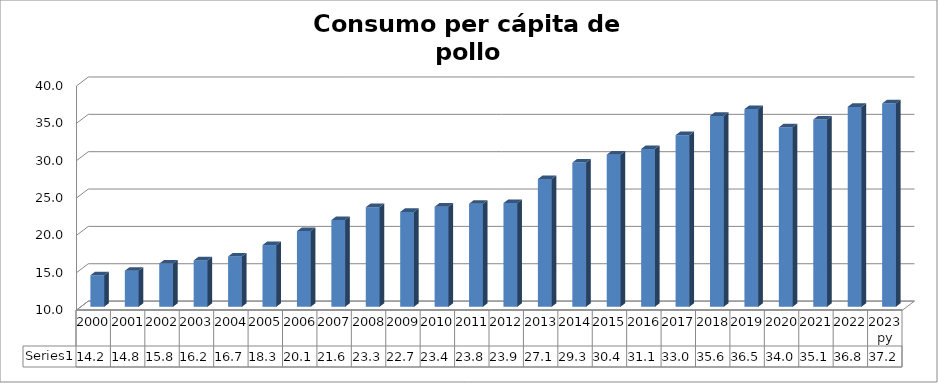
| Category | Series 0 |
|---|---|
| 2000 | 14.219 |
| 2001 | 14.829 |
| 2002 | 15.784 |
| 2003 | 16.206 |
| 2004 | 16.739 |
| 2005 | 18.264 |
| 2006 | 20.132 |
| 2007 | 21.606 |
| 2008 | 23.339 |
| 2009 | 22.7 |
| 2010 | 23.4 |
| 2011 | 23.8 |
| 2012 | 23.878 |
| 2013 | 27.1 |
| 2014 | 29.306 |
| 2015 | 30.369 |
| 2016 | 31.128 |
| 2017 | 32.978 |
| 2018 | 35.555 |
| 2019 | 36.466 |
| 2020 | 34.025 |
| 2021 | 35.07 |
| 2022 | 36.761 |
| 2023 py | 37.223 |